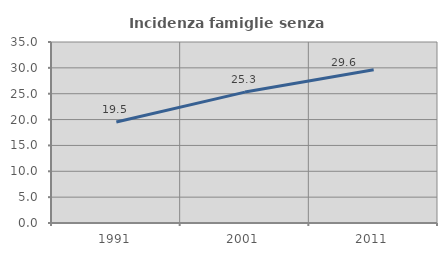
| Category | Incidenza famiglie senza nuclei |
|---|---|
| 1991.0 | 19.524 |
| 2001.0 | 25.313 |
| 2011.0 | 29.642 |